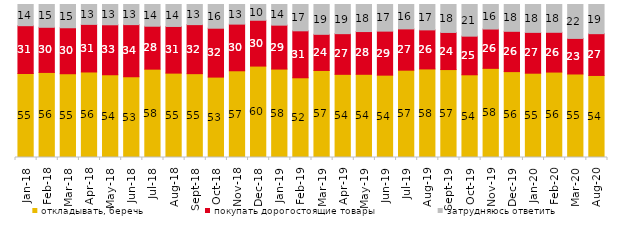
| Category | откладывать, беречь | покупать дорогостоящие товары | затрудняюсь ответить |
|---|---|---|---|
| 2018-01-01 | 54.9 | 31.25 | 13.85 |
| 2018-02-01 | 55.6 | 29.5 | 14.9 |
| 2018-03-01 | 54.75 | 30.05 | 15.2 |
| 2018-04-01 | 55.9 | 31.1 | 13 |
| 2018-05-01 | 54.05 | 32.7 | 13.25 |
| 2018-06-01 | 52.85 | 34 | 13.15 |
| 2018-07-01 | 57.75 | 28.05 | 14.2 |
| 2018-08-01 | 55.15 | 30.5 | 14.35 |
| 2018-09-01 | 54.8 | 32.05 | 13.15 |
| 2018-10-01 | 52.55 | 31.95 | 15.5 |
| 2018-11-01 | 56.687 | 30.489 | 12.824 |
| 2018-12-01 | 59.75 | 29.95 | 10.3 |
| 2019-01-01 | 57.8 | 28.7 | 13.5 |
| 2019-02-01 | 52.1 | 30.7 | 17.2 |
| 2019-03-01 | 56.887 | 23.62 | 19.493 |
| 2019-04-01 | 54.356 | 26.584 | 19.059 |
| 2019-05-01 | 54.383 | 27.935 | 17.682 |
| 2019-06-01 | 53.815 | 28.778 | 17.406 |
| 2019-07-01 | 57.079 | 26.98 | 15.941 |
| 2019-08-01 | 57.892 | 25.524 | 16.583 |
| 2019-09-01 | 57.475 | 24.257 | 18.267 |
| 2019-10-01 | 54.059 | 25.248 | 20.693 |
| 2019-11-01 | 58.267 | 25.693 | 16.04 |
| 2019-12-01 | 56.139 | 26.337 | 17.525 |
| 2020-01-01 | 55.099 | 26.683 | 18.218 |
| 2020-02-01 | 55.842 | 25.99 | 18.168 |
| 2020-03-01 | 54.586 | 23.252 | 22.162 |
| 2020-08-01 | 53.625 | 27.309 | 19.067 |